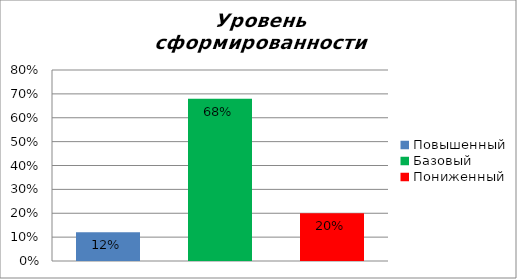
| Category | Уровень сформированности предметных результатов |
|---|---|
| Повышенный | 0.12 |
| Базовый | 0.68 |
| Пониженный | 0.2 |